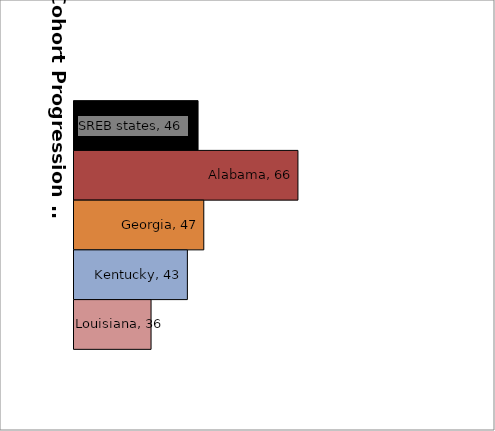
| Category | SREB states | Alabama | Georgia | Kentucky | Louisiana |
|---|---|---|---|---|---|
| 0 | 45.644 | 66.295 | 46.83 | 43.44 | 35.929 |